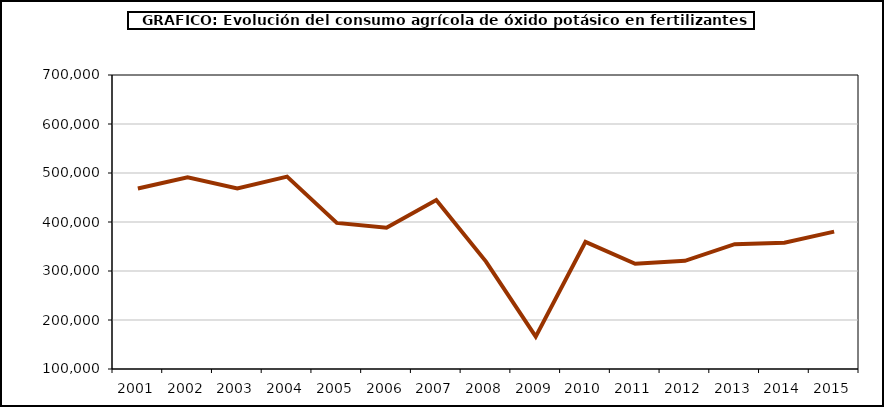
| Category | fertilizantes |
|---|---|
| 2001.0 | 468360 |
| 2002.0 | 491138 |
| 2003.0 | 468511 |
| 2004.0 | 492571 |
| 2005.0 | 398230 |
| 2006.0 | 388187 |
| 2007.0 | 444853 |
| 2008.0 | 319194 |
| 2009.0 | 166016 |
| 2010.0 | 359583 |
| 2011.0 | 314642 |
| 2012.0 | 320841 |
| 2013.0 | 354738 |
| 2014.0 | 357875 |
| 2015.0 | 380303 |